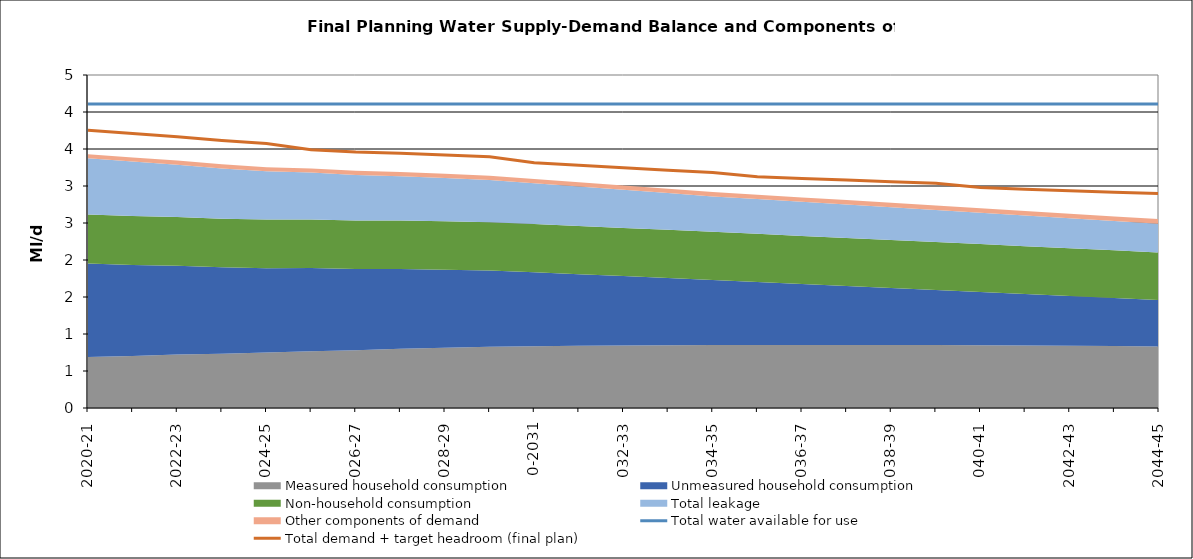
| Category | Total water available for use | Total demand + target headroom (final plan) |
|---|---|---|
| 0 | 4.109 | 3.753 |
| 1 | 4.109 | 3.709 |
| 2 | 4.109 | 3.667 |
| 3 | 4.109 | 3.614 |
| 4 | 4.109 | 3.575 |
| 5 | 4.109 | 3.49 |
| 6 | 4.109 | 3.459 |
| 7 | 4.109 | 3.444 |
| 8 | 4.109 | 3.418 |
| 9 | 4.109 | 3.395 |
| 10 | 4.109 | 3.315 |
| 11 | 4.109 | 3.28 |
| 12 | 4.109 | 3.248 |
| 13 | 4.109 | 3.213 |
| 14 | 4.109 | 3.183 |
| 15 | 4.109 | 3.124 |
| 16 | 4.109 | 3.1 |
| 17 | 4.109 | 3.08 |
| 18 | 4.109 | 3.059 |
| 19 | 4.109 | 3.038 |
| 20 | 4.109 | 2.978 |
| 21 | 4.109 | 2.956 |
| 22 | 4.109 | 2.936 |
| 23 | 4.109 | 2.915 |
| 24 | 4.109 | 2.898 |